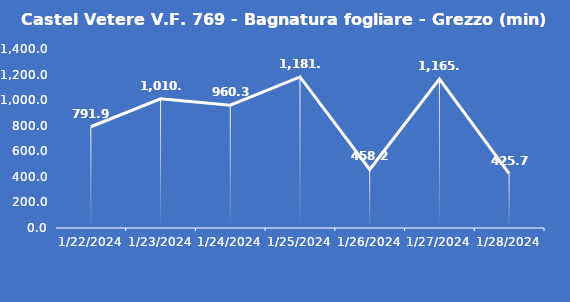
| Category | Castel Vetere V.F. 769 - Bagnatura fogliare - Grezzo (min) |
|---|---|
| 1/22/24 | 791.9 |
| 1/23/24 | 1010 |
| 1/24/24 | 960.3 |
| 1/25/24 | 1181.3 |
| 1/26/24 | 458.2 |
| 1/27/24 | 1165.1 |
| 1/28/24 | 425.7 |